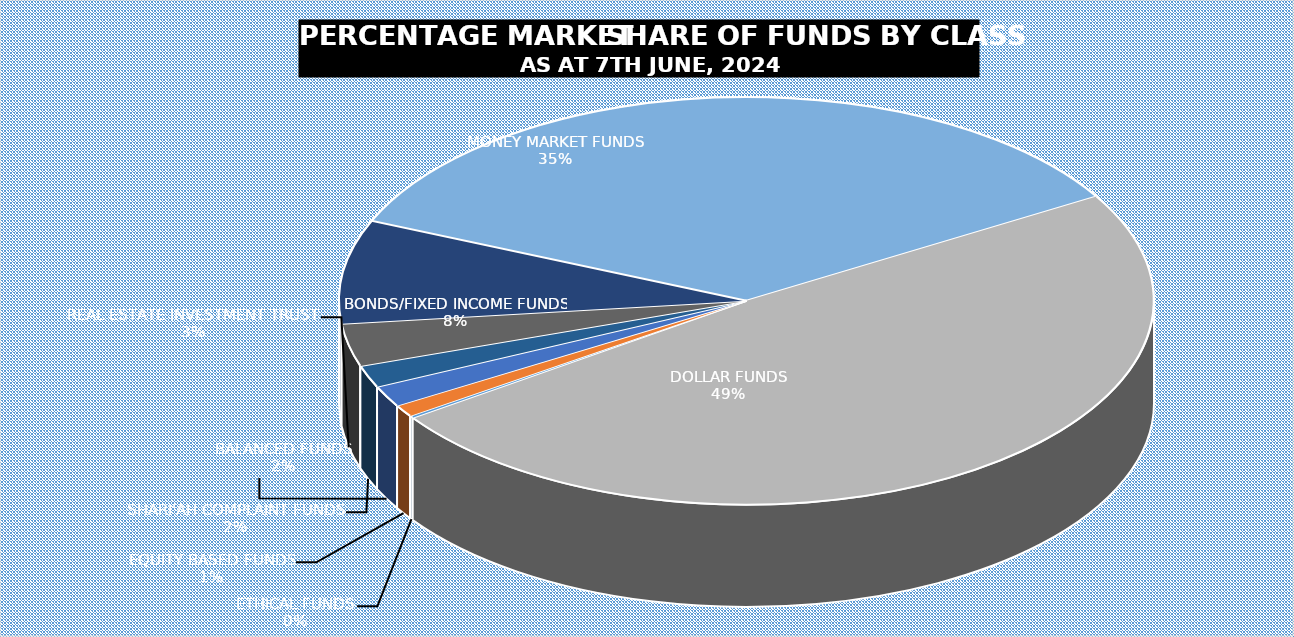
| Category | 7-Jun |
|---|---|
| ETHICAL FUNDS | 4967557316.12 |
| EQUITY BASED FUNDS | 27684716686.99 |
| BALANCED FUNDS | 48611257159.726 |
| SHARI'AH COMPLAINT FUNDS | 51054739828.693 |
| REAL ESTATE INVESTMENT TRUST | 98650430272.592 |
| BONDS/FIXED INCOME FUNDS | 238984928037.18 |
| MONEY MARKET FUNDS | 1019331524884.96 |
| DOLLAR FUNDS | 1421592979861.68 |